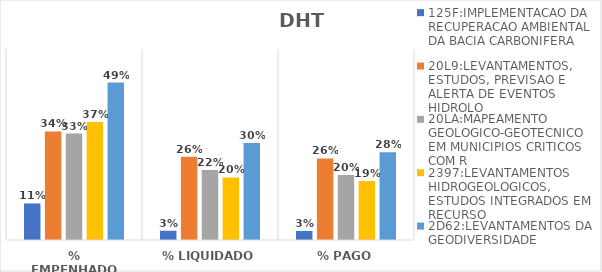
| Category | 125F:IMPLEMENTACAO DA RECUPERACAO AMBIENTAL DA BACIA CARBONIFERA | 20L9:LEVANTAMENTOS, ESTUDOS, PREVISAO E ALERTA DE EVENTOS HIDROLO | 20LA:MAPEAMENTO GEOLOGICO-GEOTECNICO EM MUNICIPIOS CRITICOS COM R | 2397:LEVANTAMENTOS HIDROGEOLOGICOS, ESTUDOS INTEGRADOS EM RECURSO | 2D62:LEVANTAMENTOS DA GEODIVERSIDADE |
|---|---|---|---|---|---|
| % EMPENHADO | 0.115 | 0.341 | 0.334 | 0.37 | 0.494 |
| % LIQUIDADO | 0.029 | 0.261 | 0.22 | 0.196 | 0.305 |
| % PAGO | 0.028 | 0.256 | 0.204 | 0.185 | 0.275 |